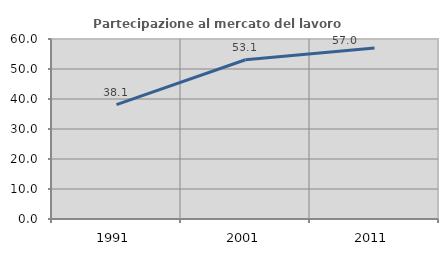
| Category | Partecipazione al mercato del lavoro  femminile |
|---|---|
| 1991.0 | 38.127 |
| 2001.0 | 53.084 |
| 2011.0 | 57.007 |